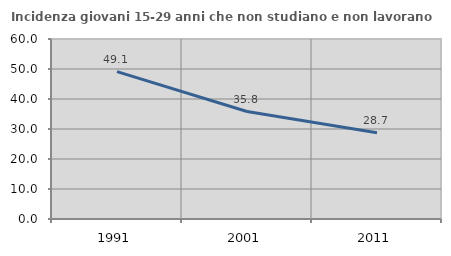
| Category | Incidenza giovani 15-29 anni che non studiano e non lavorano  |
|---|---|
| 1991.0 | 49.12 |
| 2001.0 | 35.832 |
| 2011.0 | 28.723 |